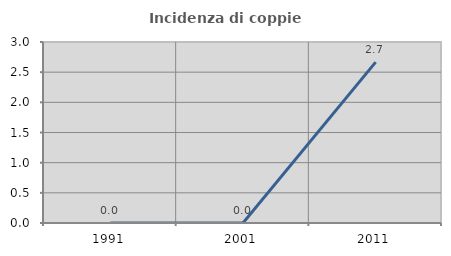
| Category | Incidenza di coppie miste |
|---|---|
| 1991.0 | 0 |
| 2001.0 | 0 |
| 2011.0 | 2.667 |